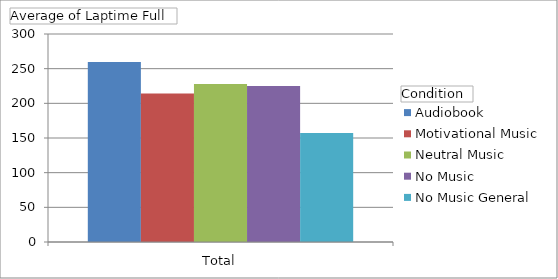
| Category | Audiobook | Motivational Music | Neutral Music | No Music | No Music General |
|---|---|---|---|---|---|
| Total | 259.607 | 214.358 | 227.765 | 225.028 | 157.344 |